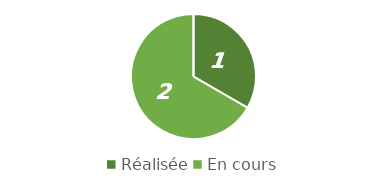
| Category | Series 0 |
|---|---|
| Réalisée | 1 |
| En cours | 2 |